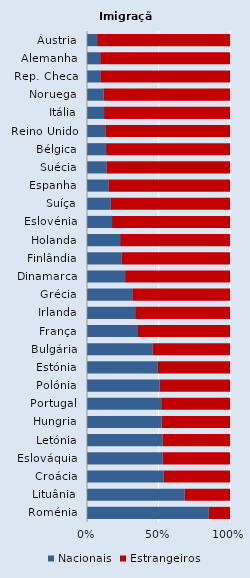
| Category | Nacionais | Estrangeiros |
|---|---|---|
| Áustria | 7.088 | 92.912 |
| Alemanha | 9.233 | 90.767 |
| Rep. Checa | 9.309 | 90.691 |
| Noruega | 11.561 | 88.439 |
| Itália | 11.934 | 88.066 |
| Reino Unido | 12.801 | 87.199 |
| Bélgica | 13.353 | 86.647 |
| Suécia | 13.561 | 86.439 |
| Espanha | 14.962 | 85.038 |
| Suíça | 16.587 | 83.413 |
| Eslovénia | 17.514 | 82.486 |
| Holanda | 23.155 | 76.845 |
| Finlândia | 24.123 | 75.877 |
| Dinamarca | 26.675 | 73.325 |
| Grécia | 31.663 | 68.337 |
| Irlanda | 33.7 | 66.3 |
| França | 35.643 | 64.357 |
| Bulgária | 45.844 | 54.156 |
| Estónia | 49.573 | 50.427 |
| Polónia | 50.801 | 49.199 |
| Portugal | 51.897 | 48.103 |
| Hungria | 52.207 | 47.793 |
| Letónia | 52.815 | 47.185 |
| Eslováquia | 52.929 | 47.071 |
| Croácia | 53.649 | 46.351 |
| Lituânia | 68.217 | 31.783 |
| Roménia | 85.185 | 14.815 |